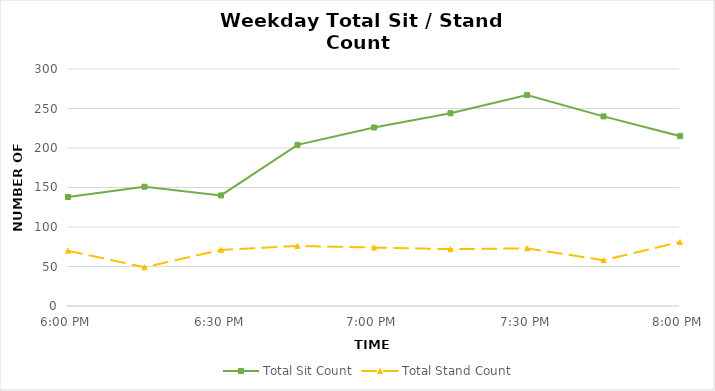
| Category | Total Sit Count | Total Stand Count |
|---|---|---|
| 0.75 | 138 | 70 |
| 0.760416666666667 | 151 | 49 |
| 0.770833333333333 | 140 | 71 |
| 0.78125 | 204 | 76 |
| 0.791666666666667 | 226 | 74 |
| 0.802083333333333 | 244 | 72 |
| 0.8125 | 267 | 73 |
| 0.822916666666667 | 240 | 58 |
| 0.833333333333333 | 215 | 81 |